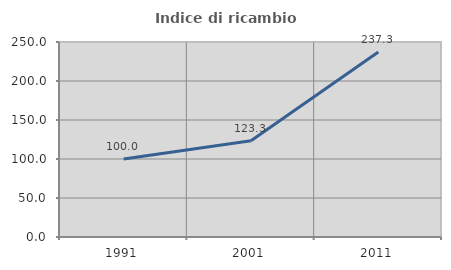
| Category | Indice di ricambio occupazionale  |
|---|---|
| 1991.0 | 100 |
| 2001.0 | 123.333 |
| 2011.0 | 237.255 |